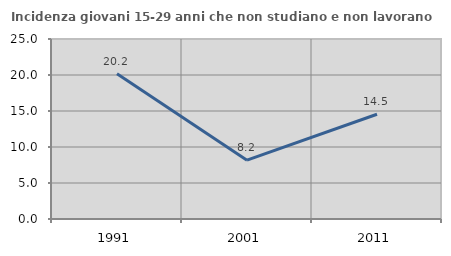
| Category | Incidenza giovani 15-29 anni che non studiano e non lavorano  |
|---|---|
| 1991.0 | 20.173 |
| 2001.0 | 8.176 |
| 2011.0 | 14.545 |